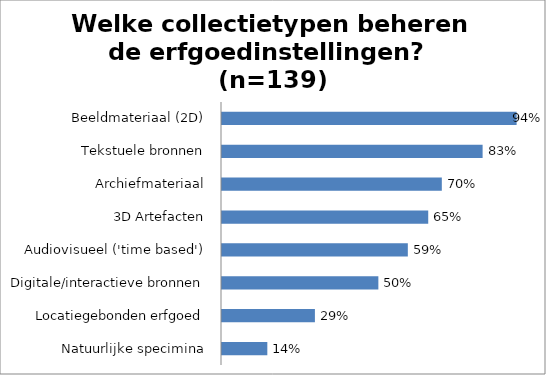
| Category | Series 0 |
|---|---|
| Natuurlijke specimina | 0.144 |
| Locatiegebonden erfgoed | 0.295 |
| Digitale/interactieve bronnen | 0.496 |
| Audiovisueel ('time based') | 0.59 |
| 3D Artefacten | 0.655 |
| Archiefmateriaal | 0.698 |
| Tekstuele bronnen | 0.827 |
| Beeldmateriaal (2D) | 0.935 |